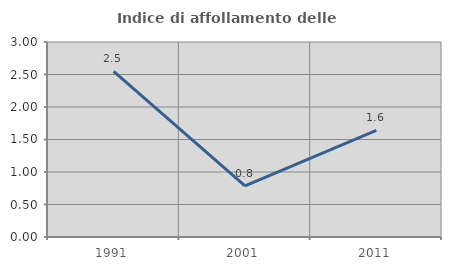
| Category | Indice di affollamento delle abitazioni  |
|---|---|
| 1991.0 | 2.548 |
| 2001.0 | 0.787 |
| 2011.0 | 1.639 |